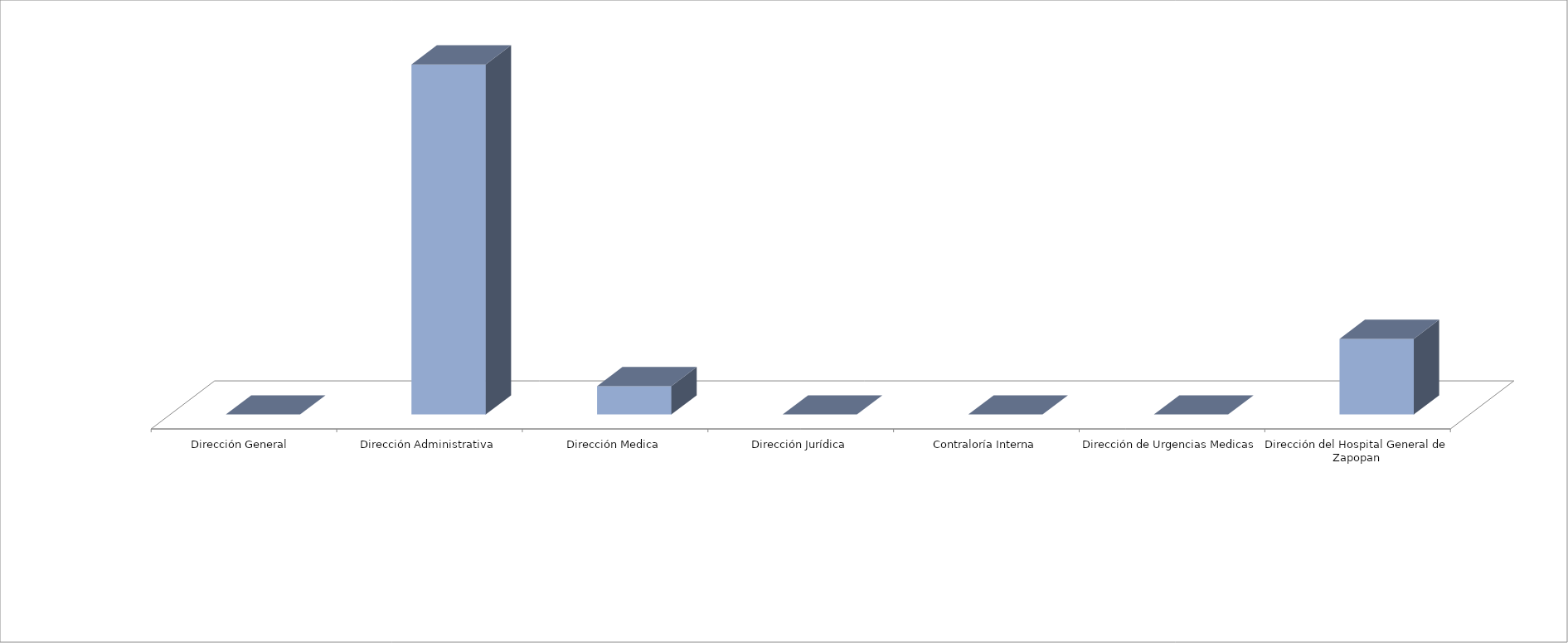
| Category | Series 0 | Series 1 |
|---|---|---|
| Dirección General  |  | 0 |
| Dirección Administrativa |  | 37 |
| Dirección Medica |  | 3 |
| Dirección Jurídica |  | 0 |
| Contraloría Interna |  | 0 |
| Dirección de Urgencias Medicas |  | 0 |
| Dirección del Hospital General de Zapopan |  | 8 |